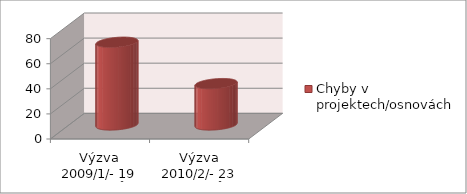
| Category | Chyby v projektech/osnovách |
|---|---|
| Výzva 2009/1/- 19 projektů | 66 |
| Výzva 2010/2/- 23 projektů  | 33 |